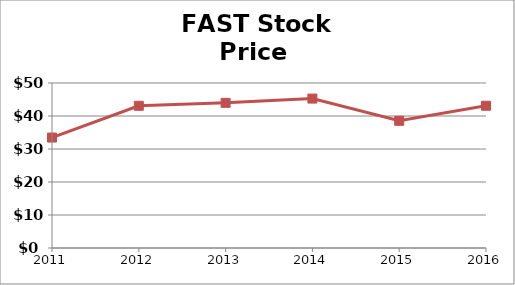
| Category | Price |
|---|---|
| 2011.0 | 33.47 |
| 2012.0 | 43.09 |
| 2013.0 | 43.99 |
| 2014.0 | 45.28 |
| 2015.0 | 38.54 |
| 2016.0 | 43.11 |